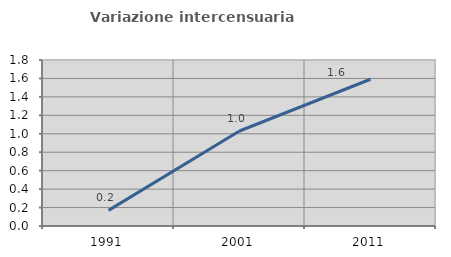
| Category | Variazione intercensuaria annua |
|---|---|
| 1991.0 | 0.169 |
| 2001.0 | 1.03 |
| 2011.0 | 1.591 |